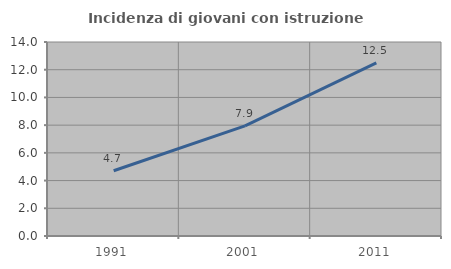
| Category | Incidenza di giovani con istruzione universitaria |
|---|---|
| 1991.0 | 4.706 |
| 2001.0 | 7.95 |
| 2011.0 | 12.5 |